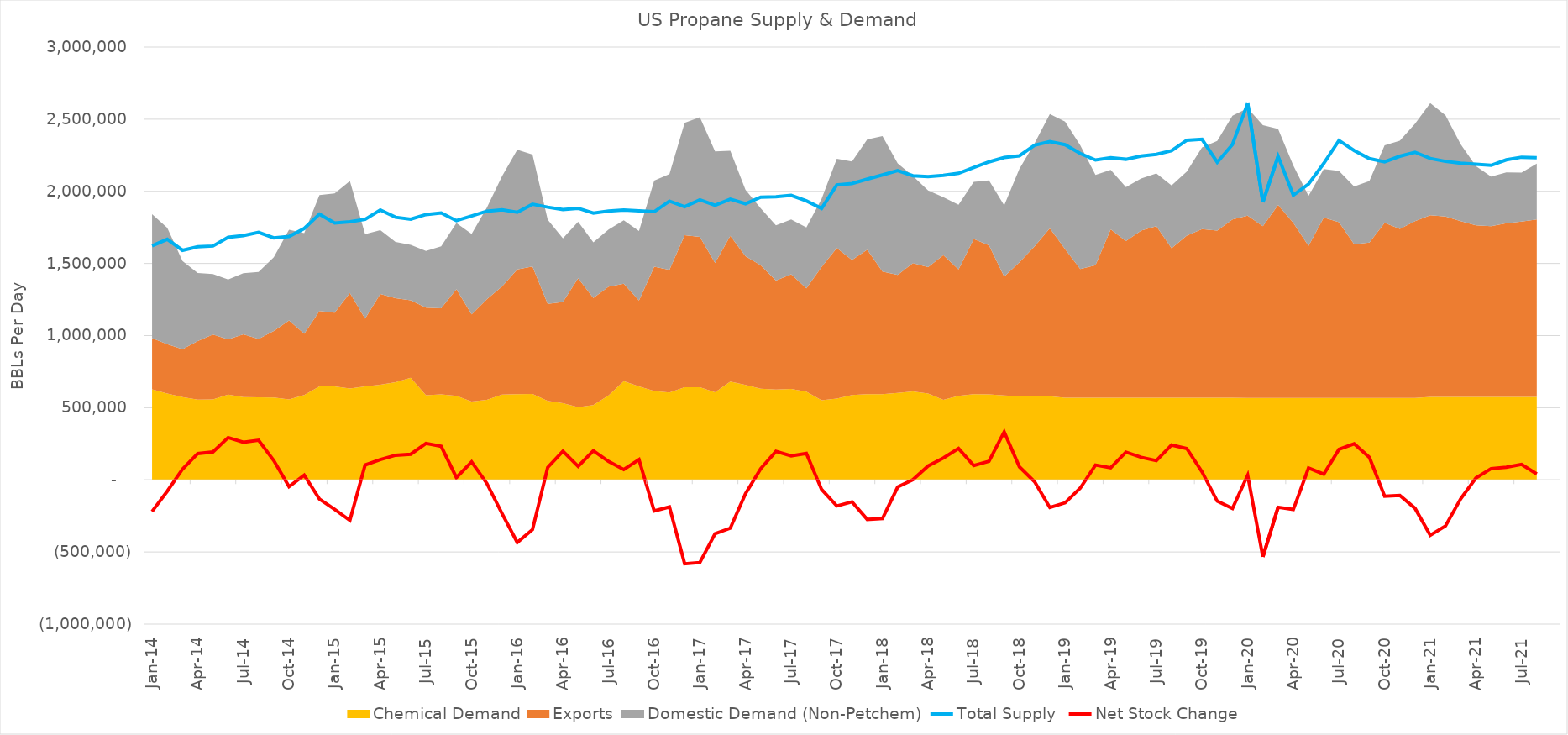
| Category | Total Supply  | Net Stock Change  |
|---|---|---|
| 2014-01-15 | 1622096.774 | -218812.004 |
| 2014-02-15 | 1667821.429 | -78513.781 |
| 2014-03-15 | 1591032.258 | 74364.262 |
| 2014-04-15 | 1615666.667 | 182207.802 |
| 2014-05-15 | 1620741.935 | 193736.502 |
| 2014-06-15 | 1681100 | 293050.86 |
| 2014-07-15 | 1692967.742 | 261088.504 |
| 2014-08-15 | 1716129.032 | 274528.162 |
| 2014-09-15 | 1677000 | 133607.39 |
| 2014-10-15 | 1686709.677 | -46792.743 |
| 2014-11-15 | 1742100 | 31982.998 |
| 2014-12-15 | 1841806.452 | -132653.105 |
| 2015-01-15 | 1780129.032 | -204661.372 |
| 2015-02-15 | 1789500 | -281201.886 |
| 2015-03-15 | 1805612.903 | 102788.25 |
| 2015-04-15 | 1870600 | 140352.809 |
| 2015-05-15 | 1820290.323 | 170704.641 |
| 2015-06-15 | 1806333.333 | 177689.058 |
| 2015-07-15 | 1838838.71 | 252485.588 |
| 2015-08-15 | 1850225.806 | 232166.674 |
| 2015-09-15 | 1796500 | 16077.309 |
| 2015-10-15 | 1829354.839 | 125142.748 |
| 2015-11-15 | 1862033.333 | -24429.85 |
| 2015-12-15 | 1871193.548 | -233155.946 |
| 2016-01-15 | 1854225.806 | -433807.116 |
| 2016-02-15 | 1910482.759 | -344954.67 |
| 2016-03-15 | 1890225.806 | 86050.25 |
| 2016-04-15 | 1873600 | 198952.211 |
| 2016-05-15 | 1882548.387 | 93436.076 |
| 2016-06-15 | 1848600 | 202097.179 |
| 2016-07-15 | 1862903.226 | 128000.653 |
| 2016-08-15 | 1870387.097 | 71346.679 |
| 2016-09-15 | 1864706.768 | 140225.543 |
| 2016-10-15 | 1858399.241 | -215469.31 |
| 2016-11-15 | 1931774.435 | -187649.831 |
| 2016-12-15 | 1892723.822 | -581602.206 |
| 2017-01-15 | 1940660.306 | -573193.799 |
| 2017-02-15 | 1903811.882 | -373222.104 |
| 2017-03-15 | 1945275.209 | -334968.793 |
| 2017-04-15 | 1913879.435 | -95813.261 |
| 2017-05-15 | 1959309.467 | 77208.867 |
| 2017-06-15 | 1962100 | 197463.175 |
| 2017-07-15 | 1971967.742 | 166694.729 |
| 2017-08-15 | 1933510.444 | 183314.166 |
| 2017-09-15 | 1881212.027 | -66547.321 |
| 2017-10-15 | 2044613.619 | -181194.289 |
| 2017-11-15 | 2054398.489 | -152314.362 |
| 2017-12-15 | 2084671.157 | -274333.4 |
| 2018-01-15 | 2113450.393 | -268758.608 |
| 2018-02-15 | 2143647.86 | -49639.725 |
| 2018-03-15 | 2108130.29 | 1712.803 |
| 2018-04-15 | 2101524.814 | 96421.608 |
| 2018-05-15 | 2110293.223 | 151703.929 |
| 2018-06-15 | 2125167.44 | 217850.972 |
| 2018-07-15 | 2164567.713 | 99130.761 |
| 2018-08-15 | 2203928.897 | 128939.214 |
| 2018-09-15 | 2234354.001 | 332504.369 |
| 2018-10-15 | 2246171.603 | 90221.547 |
| 2018-11-15 | 2319715.176 | -13701.306 |
| 2018-12-15 | 2344218.297 | -191915.327 |
| 2019-01-15 | 2323381.599 | -159214.638 |
| 2019-02-15 | 2262188.646 | -56891.146 |
| 2019-03-15 | 2216760.238 | 102679.047 |
| 2019-04-15 | 2232300.624 | 83258.594 |
| 2019-05-15 | 2222084.98 | 192367.44 |
| 2019-06-15 | 2244446.543 | 156312.921 |
| 2019-07-15 | 2256431.088 | 133095.439 |
| 2019-08-15 | 2281871.665 | 241835.108 |
| 2019-09-15 | 2354193.174 | 217307.813 |
| 2019-10-15 | 2360246.456 | 55913.839 |
| 2019-11-15 | 2201236.179 | -147668.356 |
| 2019-12-15 | 2325011.149 | -198508.845 |
| 2020-01-15 | 2609069.9 | 32087.635 |
| 2020-02-15 | 1924419.929 | -533448.857 |
| 2020-03-15 | 2242835.635 | -189964.436 |
| 2020-04-15 | 1973734.276 | -205757.772 |
| 2020-05-15 | 2050115.633 | 81619.511 |
| 2020-06-15 | 2193278.419 | 39521.413 |
| 2020-07-15 | 2352751.891 | 211592.451 |
| 2020-08-15 | 2282739.642 | 249677.419 |
| 2020-09-15 | 2227107.31 | 155466.667 |
| 2020-10-15 | 2204329.418 | -113741.935 |
| 2020-11-15 | 2242917.762 | -107580.47 |
| 2020-12-15 | 2270738.431 | -197416.411 |
| 2021-01-15 | 2227657.062 | -384170.395 |
| 2021-02-15 | 2207329.533 | -319534.017 |
| 2021-03-15 | 2194792.715 | -131365.574 |
| 2021-04-15 | 2187170.481 | 12990.553 |
| 2021-05-15 | 2180445.269 | 78019.267 |
| 2021-06-15 | 2218316.159 | 87394.065 |
| 2021-07-15 | 2236433.66 | 107301.906 |
| 2021-08-15 | 2233153.397 | 40929.151 |
| 2021-09-15 | 2243537.932 | 34665.361 |